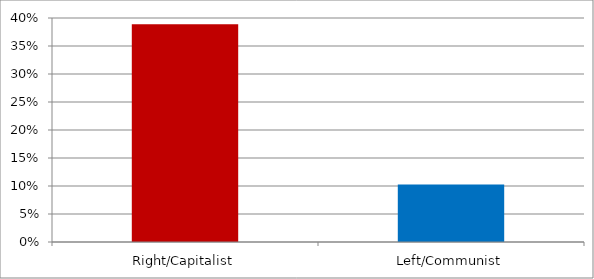
| Category | Republican Not Divided |
|---|---|
| Right/Capitalist | 0.389 |
| Left/Communist | 0.103 |